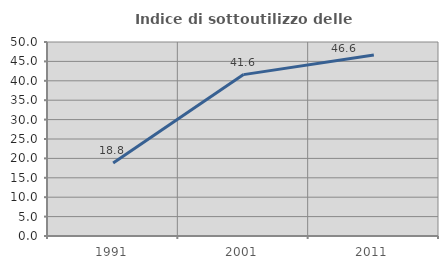
| Category | Indice di sottoutilizzo delle abitazioni  |
|---|---|
| 1991.0 | 18.81 |
| 2001.0 | 41.595 |
| 2011.0 | 46.635 |